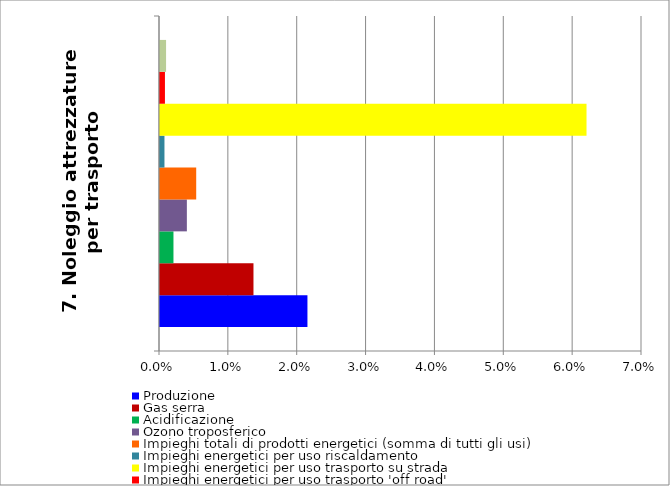
| Category | Produzione | Gas serra | Acidificazione | Ozono troposferico | Impieghi totali di prodotti energetici (somma di tutti gli usi) | Impieghi energetici per uso riscaldamento | Impieghi energetici per uso trasporto su strada | Impieghi energetici per uso trasporto 'off road' | Impieghi di elettricità |
|---|---|---|---|---|---|---|---|---|---|
| 7. Noleggio attrezzature per trasporto | 0.021 | 0.014 | 0.002 | 0.004 | 0.005 | 0.001 | 0.062 | 0.001 | 0.001 |